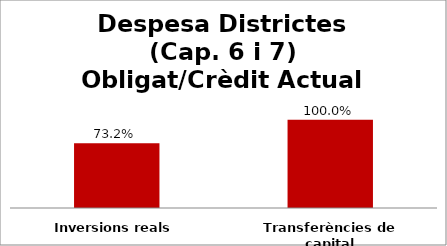
| Category | Series 0 |
|---|---|
| Inversions reals | 0.732 |
| Transferències de capital | 1 |